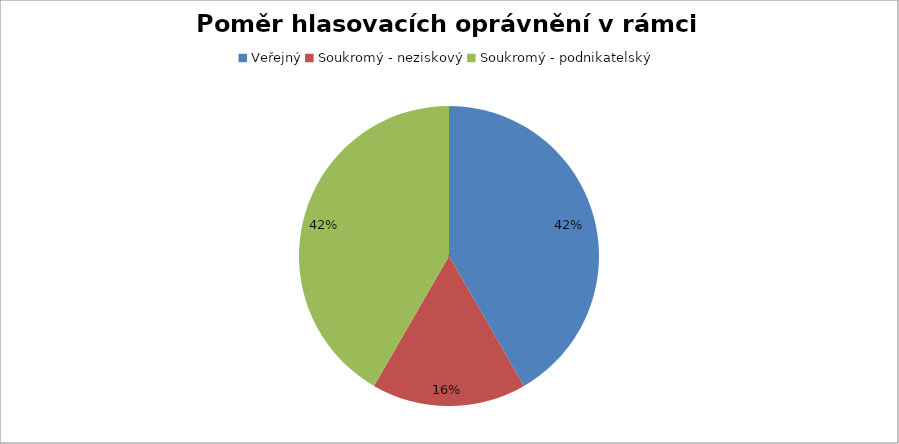
| Category | Series 0 |
|---|---|
| Veřejný | 0.417 |
| Soukromý - neziskový | 0.167 |
| Soukromý - podnikatelský | 0.417 |